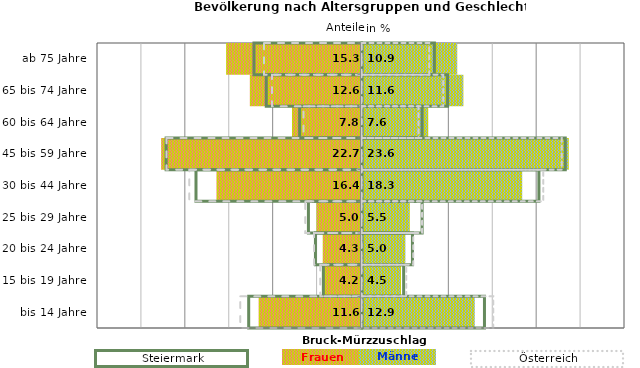
| Category | Frauen | Männer | Frauen Spalte2 | Männer Spalte2 | Frauen Spalte3 | Männer Spalte3 |
|---|---|---|---|---|---|---|
| bis 14 Jahre | -11.6 | 12.9 | 14 | -12.9 | -13.8 | 15 |
| 15 bis 19 Jahre | -4.2 | 4.5 | 4.8 | -4.4 | -4.7 | 5.1 |
| 20 bis 24 Jahre | -4.3 | 5 | 5.8 | -5.3 | -5.4 | 5.9 |
| 25 bis 29 Jahre | -5 | 5.5 | 6.9 | -6.1 | -6.4 | 6.9 |
| 30 bis 44 Jahre | -16.4 | 18.3 | 20.2 | -18.9 | -19.6 | 20.7 |
| 45 bis 59 Jahre | -22.7 | 23.6 | 23.2 | -22.3 | -22.2 | 22.8 |
| 60 bis 64 Jahre | -7.8 | 7.6 | 6.9 | -7.1 | -6.6 | 6.5 |
| 65 bis 74 Jahre | -12.6 | 11.6 | 9.8 | -10.9 | -10.2 | 9.3 |
| ab 75 Jahre | -15.3 | 10.9 | 8.3 | -12.3 | -11.1 | 7.7 |